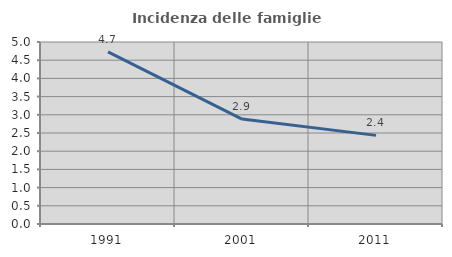
| Category | Incidenza delle famiglie numerose |
|---|---|
| 1991.0 | 4.728 |
| 2001.0 | 2.881 |
| 2011.0 | 2.435 |